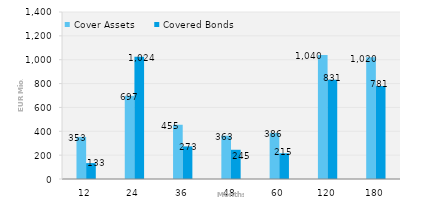
| Category | Cover Assets | Covered Bonds |
|---|---|---|
| 12.0 | 353.264 | 133.274 |
| 24.0 | 696.94 | 1024 |
| 36.0 | 454.727 | 273.164 |
| 48.0 | 362.912 | 245.082 |
| 60.0 | 386.306 | 215.164 |
| 120.0 | 1039.658 | 831.14 |
| 180.0 | 1020.333 | 780.503 |